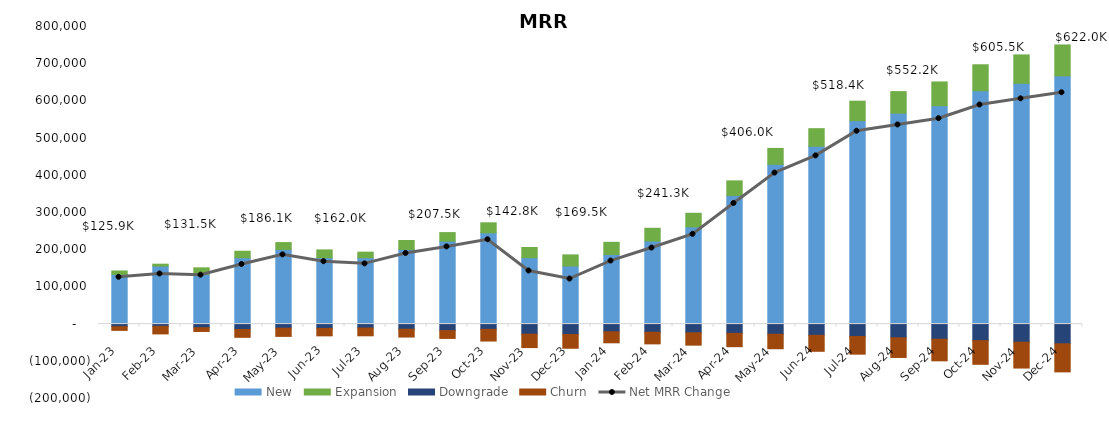
| Category | New | Expansion | Downgrade | Churn |
|---|---|---|---|---|
| 2023-01-31 | 133800 | 9000 | -6884.071 | -10000 |
| 2023-02-28 | 156100 | 5000 | -6122.416 | -20248.611 |
| 2023-03-31 | 133800 | 17500 | -9783.558 | -10000 |
| 2023-04-30 | 178400 | 17457.602 | -14527.182 | -21000 |
| 2023-05-31 | 200700 | 18483 | -11048.993 | -22000 |
| 2023-06-30 | 178400 | 21000 | -11597.553 | -20000 |
| 2023-07-31 | 178400 | 15000 | -10594.845 | -20850 |
| 2023-08-31 | 200700 | 24000 | -13822.249 | -21000 |
| 2023-09-30 | 223000 | 23000 | -17460.216 | -21000 |
| 2023-10-31 | 245300 | 27000 | -14096.427 | -31427.9 |
| 2023-11-30 | 178400 | 27500 | -27122.709 | -36000 |
| 2023-12-31 | 156100 | 30000 | -27942.744 | -37000 |
| 2024-01-31 | 187280 | 32521.622 | -20695.578 | -29565.111 |
| 2024-02-29 | 223200 | 34386.573 | -21882.364 | -31260.521 |
| 2024-03-31 | 261280 | 36635.453 | -23313.47 | -33304.957 |
| 2024-04-30 | 345700 | 39289.721 | -25002.549 | -35717.928 |
| 2024-05-31 | 429400 | 42856.682 | -27272.434 | -38960.62 |
| 2024-06-30 | 478020 | 47322.942 | -30114.6 | -43020.856 |
| 2024-07-31 | 546940 | 52297.224 | -33280.052 | -47542.931 |
| 2024-08-31 | 567000 | 57999.781 | -36908.952 | -52727.074 |
| 2024-09-30 | 587060 | 63888.782 | -40656.498 | -58080.711 |
| 2024-10-31 | 627180 | 69963.11 | -44521.979 | -63602.827 |
| 2024-11-30 | 647240 | 76442.311 | -48645.107 | -69493.01 |
| 2024-12-31 | 667300 | 83103.297 | -52883.916 | -75548.452 |